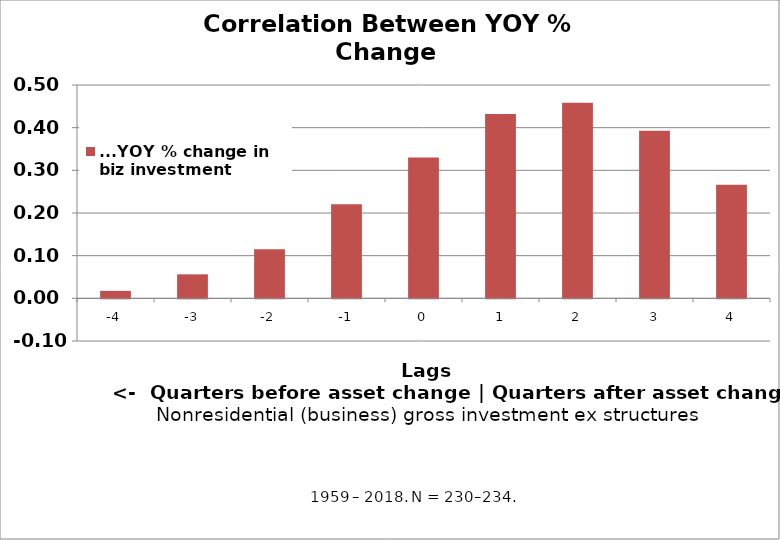
| Category | ...YOY % change in biz investment |
|---|---|
| -4.0 | 0.017 |
| -3.0 | 0.056 |
| -2.0 | 0.115 |
| -1.0 | 0.22 |
| 0.0 | 0.33 |
| 1.0 | 0.432 |
| 2.0 | 0.458 |
| 3.0 | 0.393 |
| 4.0 | 0.266 |